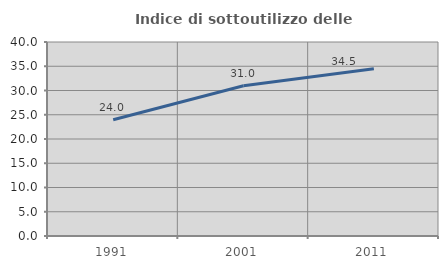
| Category | Indice di sottoutilizzo delle abitazioni  |
|---|---|
| 1991.0 | 23.964 |
| 2001.0 | 30.984 |
| 2011.0 | 34.495 |